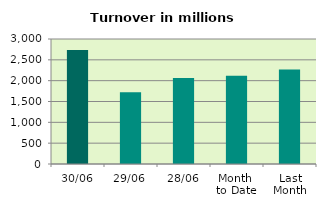
| Category | Series 0 |
|---|---|
| 30/06 | 2733.742 |
| 29/06 | 1722.573 |
| 28/06 | 2061.486 |
| Month 
to Date | 2115.436 |
| Last
Month | 2265.206 |